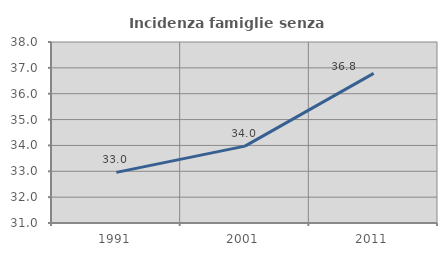
| Category | Incidenza famiglie senza nuclei |
|---|---|
| 1991.0 | 32.958 |
| 2001.0 | 33.973 |
| 2011.0 | 36.785 |